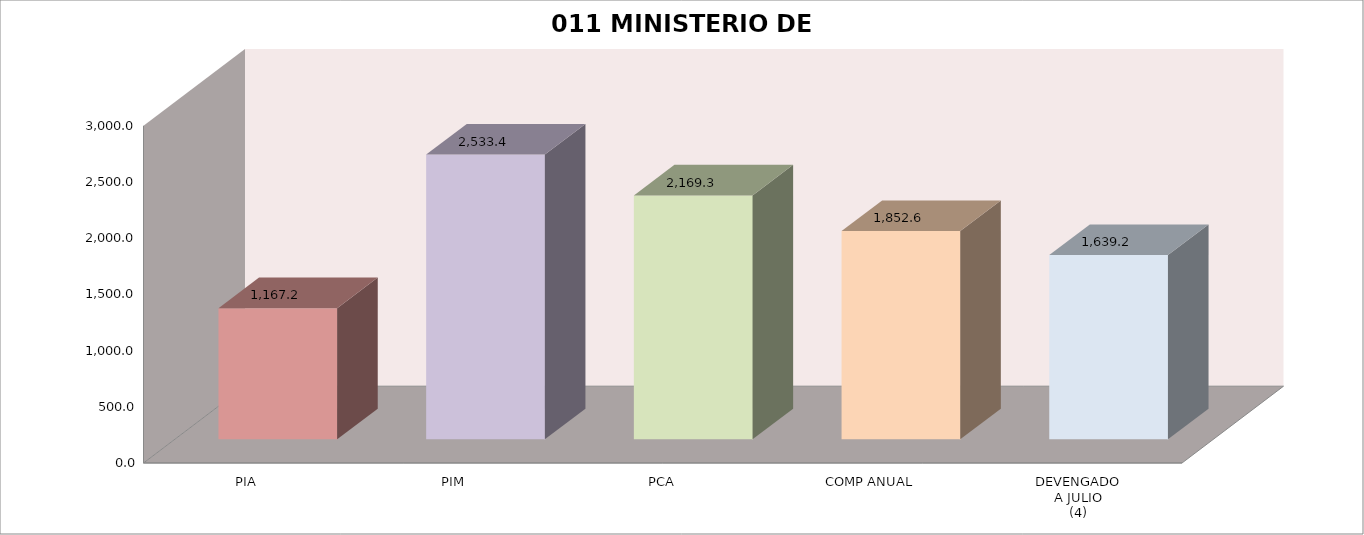
| Category | 011 MINISTERIO DE SALUD |
|---|---|
| PIA | 1167.209 |
| PIM | 2533.365 |
| PCA | 2169.31 |
| COMP ANUAL | 1852.608 |
| DEVENGADO
A JULIO
(4) | 1639.153 |